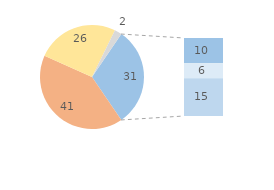
| Category | Series 0 |
|---|---|
| 0 | 41.286 |
| 1 | 25.67 |
| 2 | 2.263 |
| 3 | 10 |
| 4 | 6 |
| 5 | 15 |